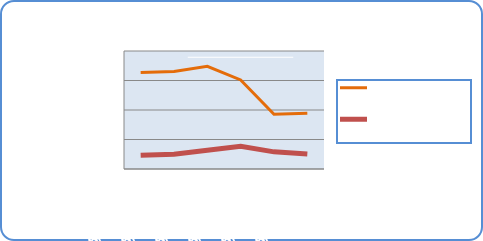
| Category | Motorin Türleri  | Benzin Türleri |
|---|---|---|
| 6/11/18 | 65395744.943 | 9341159.311 |
| 6/12/18 | 66172337.986 | 9973517.6 |
| 6/13/18 | 69571890.554 | 12696670.019 |
| 6/14/18 | 60387050.678 | 15327982.148 |
| 6/15/18 | 37136979.909 | 11619270.461 |
| 6/16/18 | 37830826.547 | 10091660.566 |